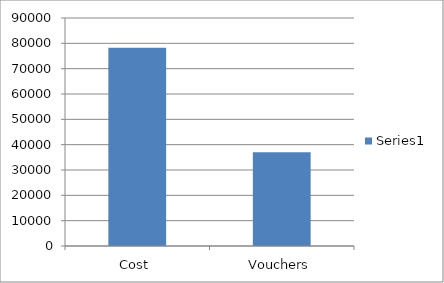
| Category | Series 0 |
|---|---|
| Cost  | 78252 |
| Vouchers | 37000 |